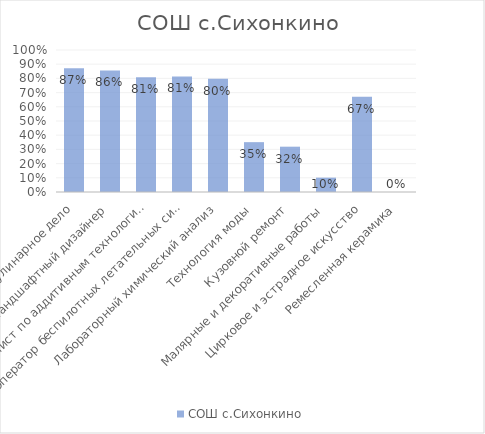
| Category | СОШ с.Сихонкино |
|---|---|
| Кулинарное дело | 0.872 |
| Ландшафтный дизайнер | 0.856 |
| Специалист по аддитивным технологиям | 0.809 |
| Оператор беспилотных летательных систем | 0.814 |
| Лабораторный химический анализ | 0.798 |
| Технология моды | 0.351 |
| Кузовной ремонт | 0.319 |
| Малярные и декоративные работы | 0.101 |
| Цирковое и эстрадное искусство | 0.67 |
| Ремесленная керамика | 0 |